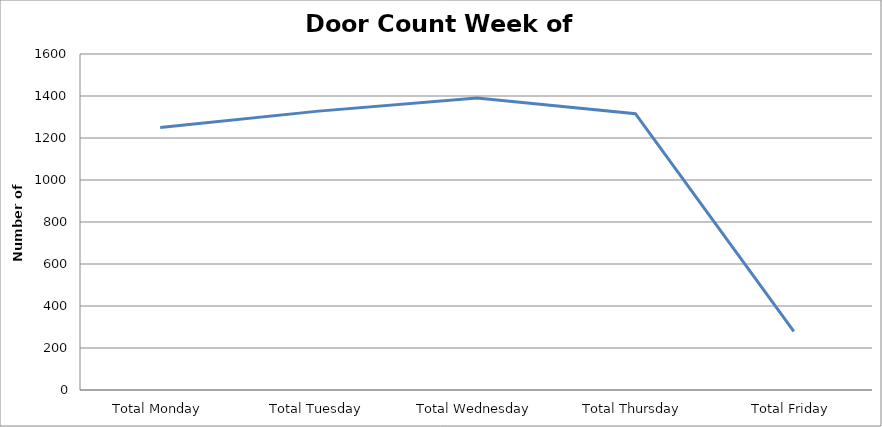
| Category | Series 0 |
|---|---|
| Total Monday | 1250 |
| Total Tuesday | 1328 |
| Total Wednesday | 1390 |
| Total Thursday | 1316 |
| Total Friday | 279.5 |